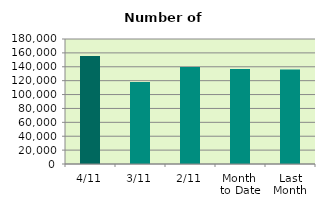
| Category | Series 0 |
|---|---|
| 4/11 | 155368 |
| 3/11 | 117912 |
| 2/11 | 139850 |
| Month 
to Date | 136730.5 |
| Last
Month | 136171.238 |